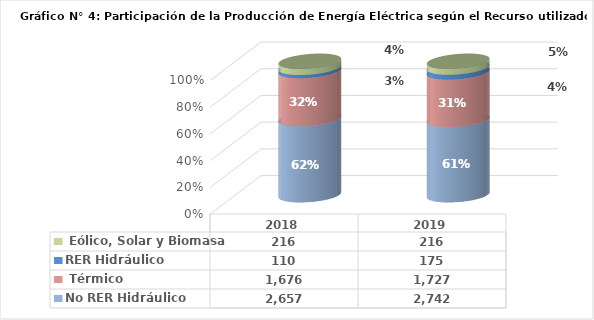
| Category | No RER | RER |
|---|---|---|
| 2018.0 | 1676.41 | 215.644 |
| 2019.0 | 1726.972 | 215.883 |